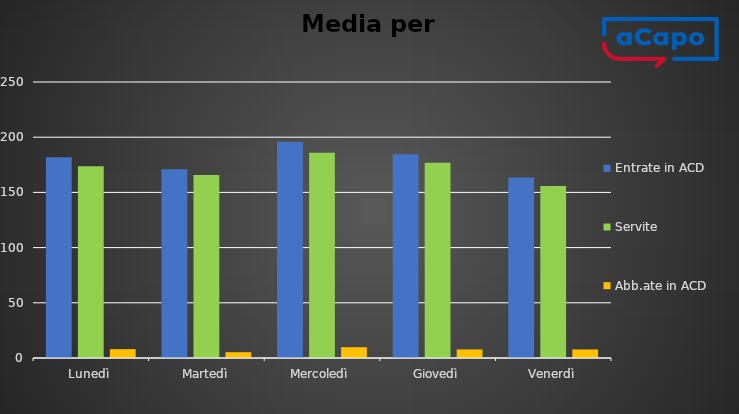
| Category | Entrate in ACD | Servite | Abb.ate in ACD |
|---|---|---|---|
| Lunedì | 181.75 | 173.75 | 8 |
| Martedì | 171 | 165.75 | 5.25 |
| Mercoledì | 195.8 | 186 | 9.8 |
| Giovedì | 184.5 | 176.75 | 7.75 |
| Venerdì | 163.5 | 155.75 | 7.75 |